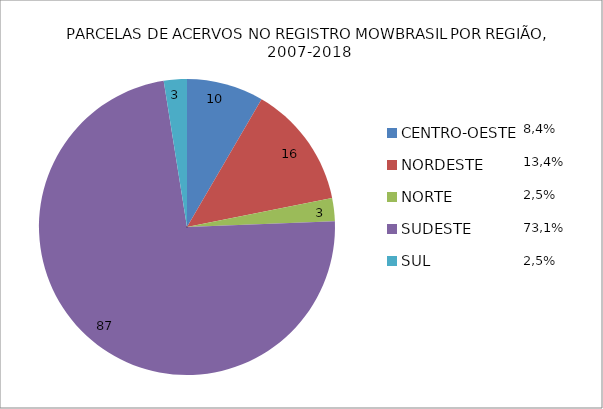
| Category | Series 0 |
|---|---|
| CENTRO-OESTE | 10 |
| NORDESTE | 16 |
| NORTE | 3 |
| SUDESTE | 87 |
| SUL | 3 |